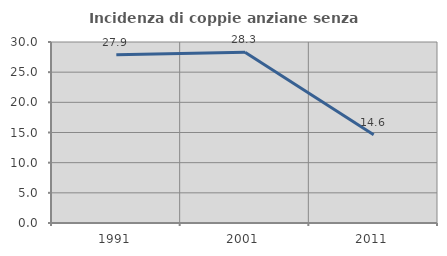
| Category | Incidenza di coppie anziane senza figli  |
|---|---|
| 1991.0 | 27.869 |
| 2001.0 | 28.302 |
| 2011.0 | 14.634 |